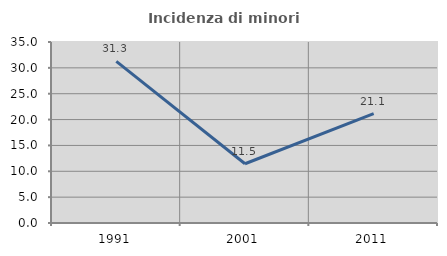
| Category | Incidenza di minori stranieri |
|---|---|
| 1991.0 | 31.25 |
| 2001.0 | 11.458 |
| 2011.0 | 21.143 |